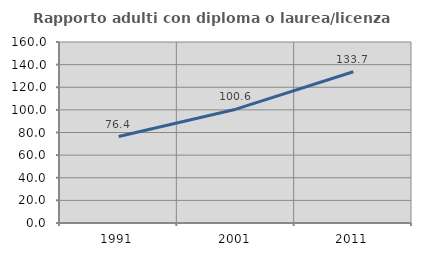
| Category | Rapporto adulti con diploma o laurea/licenza media  |
|---|---|
| 1991.0 | 76.43 |
| 2001.0 | 100.609 |
| 2011.0 | 133.676 |